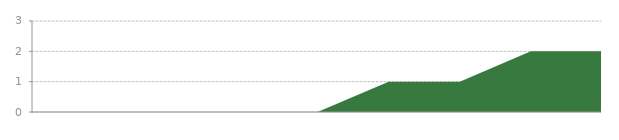
| Category | Series 0 |
|---|---|
| 0 | 0 |
| 1 | 0 |
| 2 | 0 |
| 3 | 0 |
| 4 | 0 |
| 5 | 1 |
| 6 | 1 |
| 7 | 2 |
| 8 | 2 |